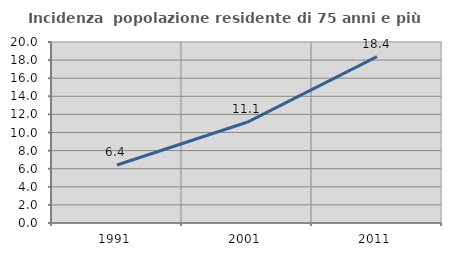
| Category | Incidenza  popolazione residente di 75 anni e più |
|---|---|
| 1991.0 | 6.413 |
| 2001.0 | 11.128 |
| 2011.0 | 18.393 |